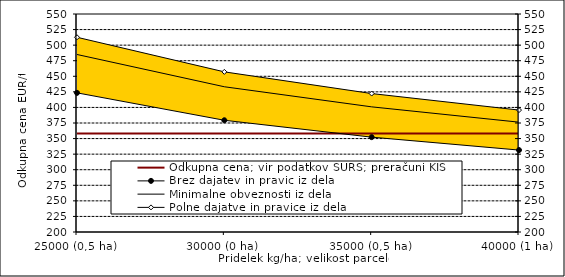
| Category | Odkupna cena; vir podatkov SURS; preračuni KIS |
|---|---|
| 25000 (0,5 ha) | 358 |
| 30000 (0 ha) | 358 |
| 35000 (0,5 ha) | 358 |
| 40000 (1 ha) | 358 |